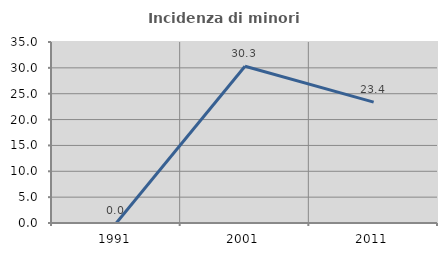
| Category | Incidenza di minori stranieri |
|---|---|
| 1991.0 | 0 |
| 2001.0 | 30.303 |
| 2011.0 | 23.377 |